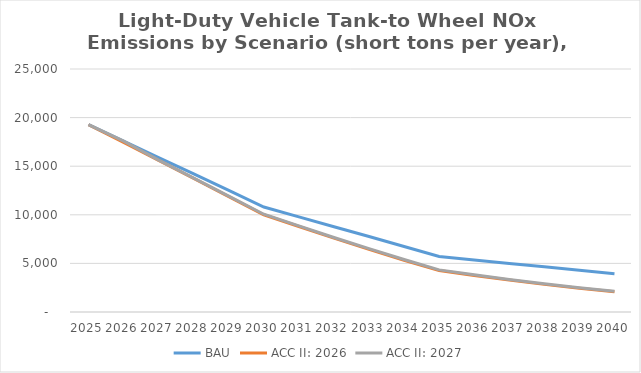
| Category | BAU | ACC II: 2026 | ACC II: 2027 |
|---|---|---|---|
| 2025.0 | 19268.013 | 19268.013 | 19268.013 |
| 2026.0 | 17575.917 | 17452.01 | 17575.917 |
| 2027.0 | 15890.567 | 15603.85 | 15624.626 |
| 2028.0 | 14201.973 | 13747.694 | 13779.642 |
| 2029.0 | 12508.112 | 11872.161 | 11915.508 |
| 2030.0 | 10804.125 | 10005.608 | 10058.066 |
| 2031.0 | 9792.087 | 8793.824 | 8856.603 |
| 2032.0 | 8776.922 | 7598.12 | 7668.705 |
| 2033.0 | 7760.467 | 6439.236 | 6514.054 |
| 2034.0 | 6743.309 | 5327.332 | 5402.632 |
| 2035.0 | 5704.251 | 4259.716 | 4331.35 |
| 2036.0 | 5353.341 | 3754.65 | 3828.054 |
| 2037.0 | 5001.274 | 3282.125 | 3354.702 |
| 2038.0 | 4648.238 | 2842.655 | 2912.261 |
| 2039.0 | 4295.998 | 2437.567 | 2501.686 |
| 2040.0 | 3943.384 | 2072.401 | 2128.763 |